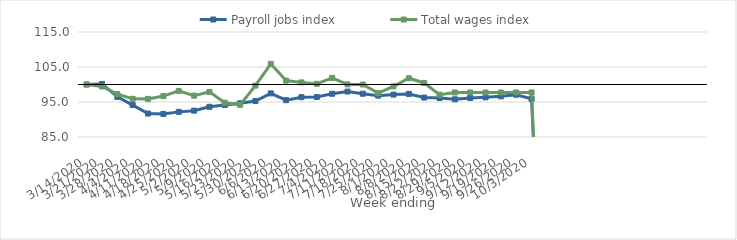
| Category | Payroll jobs index | Total wages index |
|---|---|---|
| 14/03/2020 | 100 | 100 |
| 21/03/2020 | 100.159 | 99.437 |
| 28/03/2020 | 96.468 | 97.28 |
| 04/04/2020 | 94.126 | 95.911 |
| 11/04/2020 | 91.698 | 95.888 |
| 18/04/2020 | 91.581 | 96.69 |
| 25/04/2020 | 92.18 | 98.164 |
| 02/05/2020 | 92.527 | 96.817 |
| 09/05/2020 | 93.623 | 97.893 |
| 16/05/2020 | 94.143 | 94.79 |
| 23/05/2020 | 94.629 | 94.195 |
| 30/05/2020 | 95.29 | 99.69 |
| 06/06/2020 | 97.46 | 105.9 |
| 13/06/2020 | 95.51 | 101.111 |
| 20/06/2020 | 96.378 | 100.594 |
| 27/06/2020 | 96.418 | 100.193 |
| 04/07/2020 | 97.346 | 101.895 |
| 11/07/2020 | 97.984 | 100.03 |
| 18/07/2020 | 97.362 | 99.999 |
| 25/07/2020 | 96.819 | 97.524 |
| 01/08/2020 | 97.111 | 99.472 |
| 08/08/2020 | 97.308 | 101.794 |
| 15/08/2020 | 96.272 | 100.437 |
| 22/08/2020 | 96.138 | 97.104 |
| 29/08/2020 | 95.764 | 97.72 |
| 05/09/2020 | 96.154 | 97.72 |
| 12/09/2020 | 96.337 | 97.721 |
| 19/09/2020 | 96.616 | 97.721 |
| 26/09/2020 | 97.089 | 97.72 |
| 03/10/2020 | 95.88 | 97.72 |